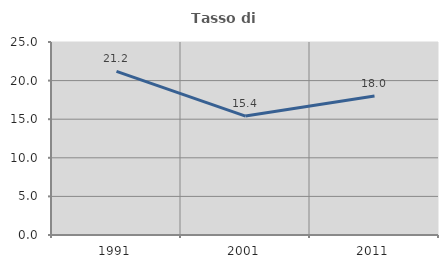
| Category | Tasso di occupazione   |
|---|---|
| 1991.0 | 21.189 |
| 2001.0 | 15.402 |
| 2011.0 | 18 |